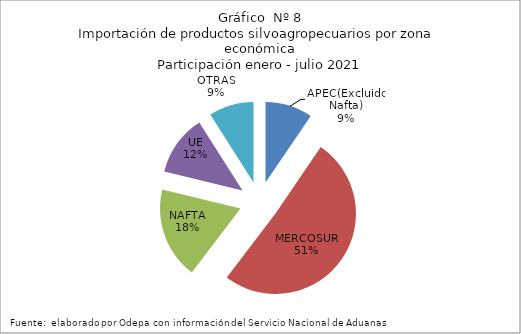
| Category | Series 0 |
|---|---|
| APEC(Excluido Nafta) | 483825.287 |
| MERCOSUR | 2589792.689 |
| NAFTA | 939311.601 |
| UE | 620708.228 |
| OTRAS | 459439.196 |